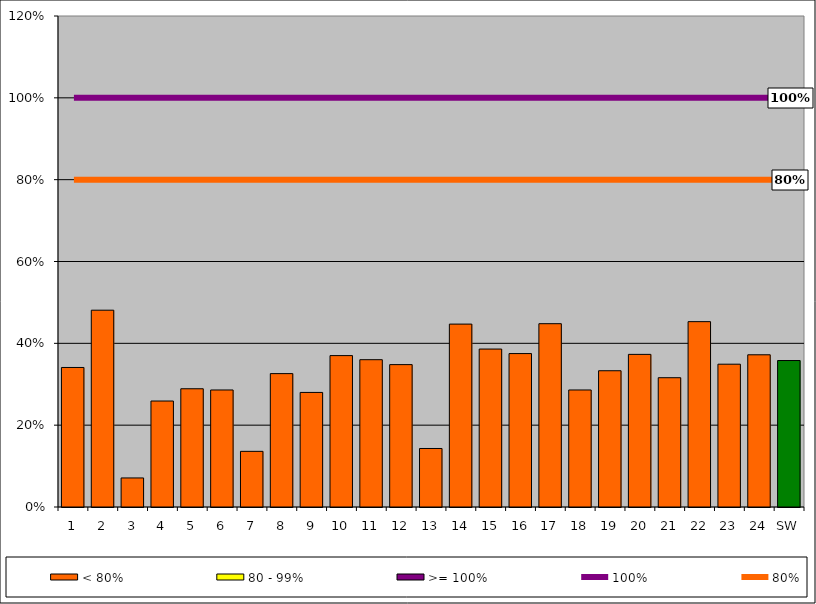
| Category | < 80% | 80 - 99% | >= 100% |
|---|---|---|---|
| 1 | 0.341 | 0 | 0 |
| 2 | 0.481 | 0 | 0 |
| 3 | 0.071 | 0 | 0 |
| 4 | 0.259 | 0 | 0 |
| 5 | 0.289 | 0 | 0 |
| 6 | 0.286 | 0 | 0 |
| 7 | 0.136 | 0 | 0 |
| 8 | 0.326 | 0 | 0 |
| 9 | 0.28 | 0 | 0 |
| 10 | 0.37 | 0 | 0 |
| 11 | 0.36 | 0 | 0 |
| 12 | 0.348 | 0 | 0 |
| 13 | 0.143 | 0 | 0 |
| 14 | 0.447 | 0 | 0 |
| 15 | 0.386 | 0 | 0 |
| 16 | 0.375 | 0 | 0 |
| 17 | 0.448 | 0 | 0 |
| 18 | 0.286 | 0 | 0 |
| 19 | 0.333 | 0 | 0 |
| 20 | 0.373 | 0 | 0 |
| 21 | 0.316 | 0 | 0 |
| 22 | 0.453 | 0 | 0 |
| 23 | 0.349 | 0 | 0 |
| 24 | 0.372 | 0 | 0 |
| SW | 0.358 | 0 | 0 |